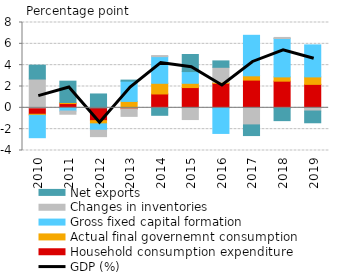
| Category | Household consumption expenditure | Actual final governemnt consumption | Gross fixed capital formation | Changes in inventories | Net exports |
|---|---|---|---|---|---|
| 2010.0 | -0.6 | -0.1 | -2.1 | 2.7 | 1.3 |
| 2011.0 | 0.4 | 0.1 | -0.3 | -0.3 | 2 |
| 2012.0 | -1.2 | -0.3 | -0.6 | -0.6 | 1.3 |
| 2013.0 | -0.1 | 0.6 | 1.9 | -0.7 | 0.1 |
| 2014.0 | 1.3 | 1 | 2.5 | 0.1 | -0.7 |
| 2015.0 | 1.9 | 0.4 | 1.1 | -1.1 | 1.6 |
| 2016.0 | 2.3 | 0.1 | -2.4 | 1.4 | 0.6 |
| 2017.0 | 2.6 | 0.4 | 3.8 | -1.6 | -1 |
| 2018.0 | 2.5 | 0.4 | 3.6 | 0.1 | -1.2 |
| 2019.0 | 2.2 | 0.7 | 3 | -0.3 | -1.1 |